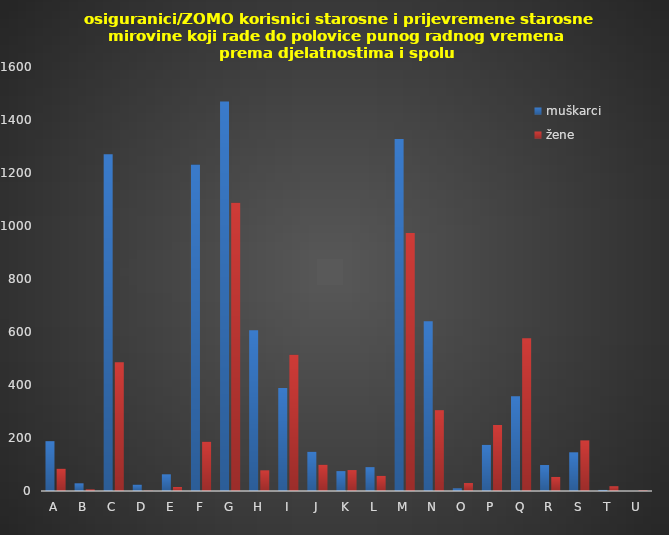
| Category | muškarci | žene |
|---|---|---|
| A | 188 | 84 |
| B | 29 | 6 |
| C | 1271 | 486 |
| D | 24 | 1 |
| E | 63 | 15 |
| F | 1232 | 186 |
| G | 1470 | 1088 |
| H | 607 | 78 |
| I | 389 | 514 |
| J | 148 | 99 |
| K | 75 | 79 |
| L | 90 | 57 |
| M | 1328 | 974 |
| N | 641 | 305 |
| O | 10 | 30 |
| P | 174 | 249 |
| Q | 358 | 576 |
| R | 98 | 53 |
| S | 146 | 191 |
| T | 4 | 18 |
| U | 0 | 2 |